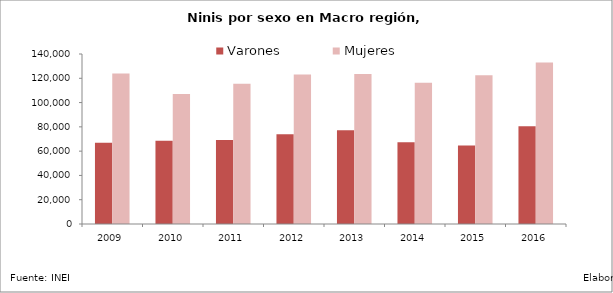
| Category | Varones | Mujeres |
|---|---|---|
| 2009.0 | 66874.31 | 123865.69 |
| 2010.0 | 68502.25 | 107005.29 |
| 2011.0 | 69088.92 | 115508.38 |
| 2012.0 | 73967.09 | 123154.03 |
| 2013.0 | 77203.43 | 123508.96 |
| 2014.0 | 67296.84 | 116248.19 |
| 2015.0 | 64731.76 | 122594.27 |
| 2016.0 | 80463.11 | 133055.6 |